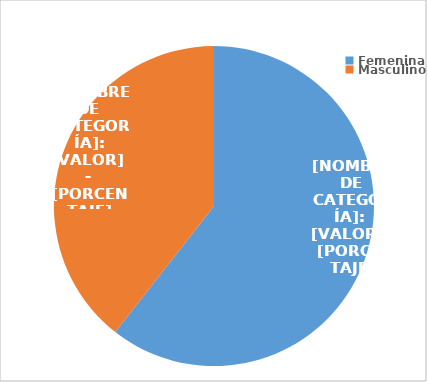
| Category | Series 0 |
|---|---|
| Femenina | 3366 |
| Masculino | 2190 |